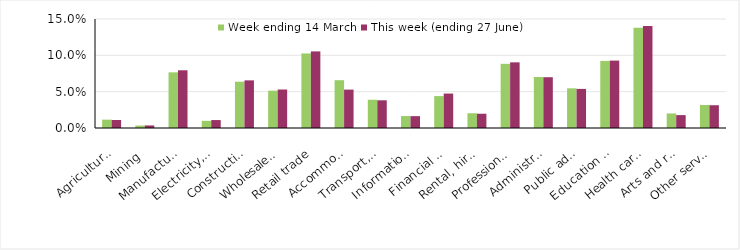
| Category | Week ending 14 March | This week (ending 27 June) |
|---|---|---|
| Agriculture, forestry and fishing | 0.011 | 0.011 |
| Mining | 0.003 | 0.004 |
| Manufacturing | 0.077 | 0.079 |
| Electricity, gas, water and waste services | 0.01 | 0.011 |
| Construction | 0.064 | 0.066 |
| Wholesale trade | 0.051 | 0.053 |
| Retail trade | 0.103 | 0.105 |
| Accommodation and food services | 0.066 | 0.053 |
| Transport, postal and warehousing | 0.039 | 0.038 |
| Information media and telecommunications | 0.016 | 0.016 |
| Financial and insurance services | 0.044 | 0.047 |
| Rental, hiring and real estate services | 0.02 | 0.02 |
| Professional, scientific and technical services | 0.088 | 0.09 |
| Administrative and support services | 0.07 | 0.07 |
| Public administration and safety | 0.055 | 0.054 |
| Education and training | 0.092 | 0.093 |
| Health care and social assistance | 0.138 | 0.14 |
| Arts and recreation services | 0.02 | 0.018 |
| Other services | 0.032 | 0.031 |